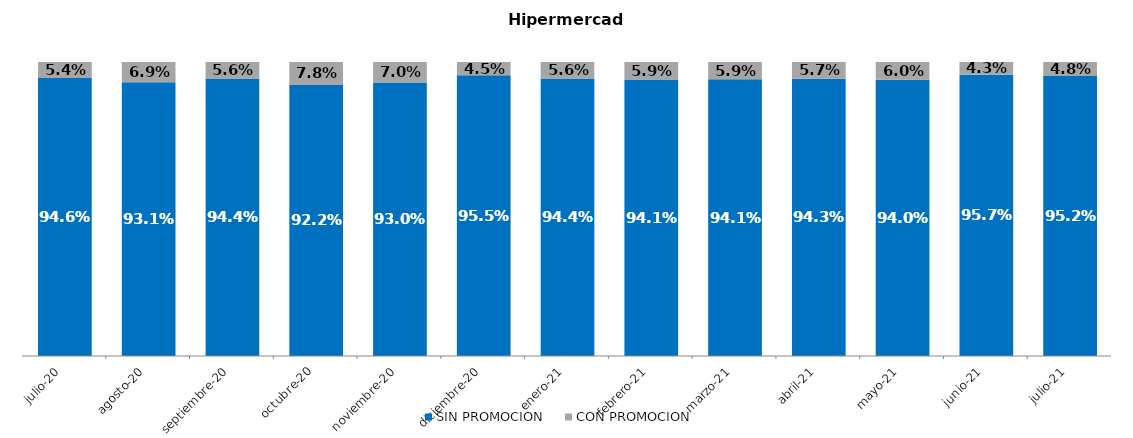
| Category | SIN PROMOCION   | CON PROMOCION   |
|---|---|---|
| 2020-07-01 | 0.946 | 0.054 |
| 2020-08-01 | 0.931 | 0.069 |
| 2020-09-01 | 0.944 | 0.056 |
| 2020-10-01 | 0.922 | 0.078 |
| 2020-11-01 | 0.93 | 0.07 |
| 2020-12-01 | 0.955 | 0.045 |
| 2021-01-01 | 0.944 | 0.056 |
| 2021-02-01 | 0.941 | 0.059 |
| 2021-03-01 | 0.941 | 0.059 |
| 2021-04-01 | 0.943 | 0.057 |
| 2021-05-01 | 0.94 | 0.06 |
| 2021-06-01 | 0.957 | 0.043 |
| 2021-07-01 | 0.952 | 0.048 |